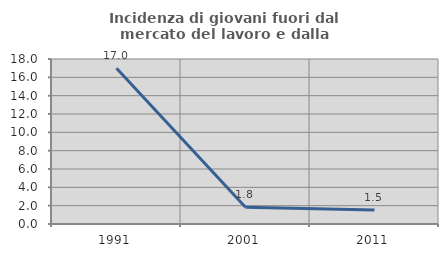
| Category | Incidenza di giovani fuori dal mercato del lavoro e dalla formazione  |
|---|---|
| 1991.0 | 16.981 |
| 2001.0 | 1.818 |
| 2011.0 | 1.515 |